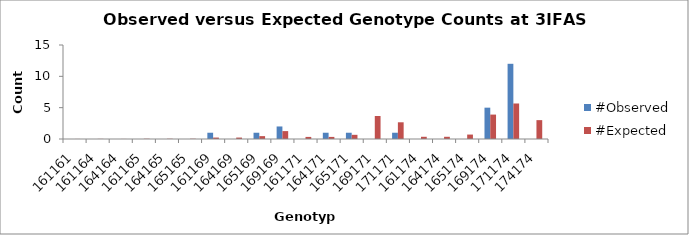
| Category | #Observed | #Expected |
|---|---|---|
| 161161.0 | 0 | 0.01 |
| 161164.0 | 0 | 0.021 |
| 164164.0 | 0 | 0.01 |
| 161165.0 | 0 | 0.042 |
| 164165.0 | 0 | 0.042 |
| 165165.0 | 0 | 0.042 |
| 161169.0 | 1 | 0.229 |
| 164169.0 | 0 | 0.229 |
| 165169.0 | 1 | 0.458 |
| 169169.0 | 2 | 1.26 |
| 161171.0 | 0 | 0.333 |
| 164171.0 | 1 | 0.333 |
| 165171.0 | 1 | 0.667 |
| 169171.0 | 0 | 3.667 |
| 171171.0 | 1 | 2.667 |
| 161174.0 | 0 | 0.354 |
| 164174.0 | 0 | 0.354 |
| 165174.0 | 0 | 0.708 |
| 169174.0 | 5 | 3.896 |
| 171174.0 | 12 | 5.667 |
| 174174.0 | 0 | 3.01 |